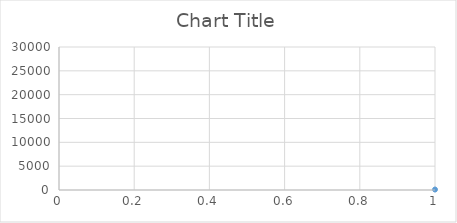
| Category | Series 0 |
|---|---|
| 0 | 100 |
| 1 | 103 |
| 2 | 106.09 |
| 3 | 109.273 |
| 4 | 112.551 |
| 5 | 115.927 |
| 6 | 119.405 |
| 7 | 122.987 |
| 8 | 126.677 |
| 9 | 130.477 |
| 10 | 134.392 |
| 11 | 138.423 |
| 12 | 142.576 |
| 13 | 146.853 |
| 14 | 151.259 |
| 15 | 155.797 |
| 16 | 160.471 |
| 17 | 165.285 |
| 18 | 170.243 |
| 19 | 175.351 |
| 20 | 180.611 |
| 21 | 186.029 |
| 22 | 191.61 |
| 23 | 197.359 |
| 24 | 203.279 |
| 25 | 209.378 |
| 26 | 215.659 |
| 27 | 222.129 |
| 28 | 228.793 |
| 29 | 235.657 |
| 30 | 242.726 |
| 31 | 250.008 |
| 32 | 257.508 |
| 33 | 265.234 |
| 34 | 273.191 |
| 35 | 281.386 |
| 36 | 289.828 |
| 37 | 298.523 |
| 38 | 307.478 |
| 39 | 316.703 |
| 40 | 326.204 |
| 41 | 335.99 |
| 42 | 346.07 |
| 43 | 356.452 |
| 44 | 367.145 |
| 45 | 378.16 |
| 46 | 389.504 |
| 47 | 401.19 |
| 48 | 413.225 |
| 49 | 425.622 |
| 50 | 438.391 |
| 51 | 451.542 |
| 52 | 465.089 |
| 53 | 479.041 |
| 54 | 493.412 |
| 55 | 508.215 |
| 56 | 523.461 |
| 57 | 539.165 |
| 58 | 555.34 |
| 59 | 572 |
| 60 | 589.16 |
| 61 | 606.835 |
| 62 | 625.04 |
| 63 | 643.791 |
| 64 | 663.105 |
| 65 | 682.998 |
| 66 | 703.488 |
| 67 | 724.593 |
| 68 | 746.331 |
| 69 | 768.721 |
| 70 | 791.782 |
| 71 | 815.536 |
| 72 | 840.002 |
| 73 | 865.202 |
| 74 | 891.158 |
| 75 | 917.893 |
| 76 | 945.429 |
| 77 | 973.792 |
| 78 | 1003.006 |
| 79 | 1033.096 |
| 80 | 1064.089 |
| 81 | 1096.012 |
| 82 | 1128.892 |
| 83 | 1162.759 |
| 84 | 1197.642 |
| 85 | 1233.571 |
| 86 | 1270.578 |
| 87 | 1308.695 |
| 88 | 1347.956 |
| 89 | 1388.395 |
| 90 | 1430.047 |
| 91 | 1472.948 |
| 92 | 1517.137 |
| 93 | 1562.651 |
| 94 | 1609.53 |
| 95 | 1657.816 |
| 96 | 1707.551 |
| 97 | 1758.777 |
| 98 | 1811.54 |
| 99 | 1865.887 |
| 100 | 1921.863 |
| 101 | 1979.519 |
| 102 | 2038.905 |
| 103 | 2100.072 |
| 104 | 2163.074 |
| 105 | 2227.966 |
| 106 | 2294.805 |
| 107 | 2363.649 |
| 108 | 2434.559 |
| 109 | 2507.596 |
| 110 | 2582.823 |
| 111 | 2660.308 |
| 112 | 2740.117 |
| 113 | 2822.321 |
| 114 | 2906.991 |
| 115 | 2994.2 |
| 116 | 3084.026 |
| 117 | 3176.547 |
| 118 | 3271.843 |
| 119 | 3369.999 |
| 120 | 3471.099 |
| 121 | 3575.232 |
| 122 | 3682.489 |
| 123 | 3792.963 |
| 124 | 3906.752 |
| 125 | 4023.955 |
| 126 | 4144.673 |
| 127 | 4269.014 |
| 128 | 4397.084 |
| 129 | 4528.997 |
| 130 | 4664.866 |
| 131 | 4804.812 |
| 132 | 4948.957 |
| 133 | 5097.425 |
| 134 | 5250.348 |
| 135 | 5407.859 |
| 136 | 5570.094 |
| 137 | 5737.197 |
| 138 | 5909.313 |
| 139 | 6086.593 |
| 140 | 6269.19 |
| 141 | 6457.266 |
| 142 | 6650.984 |
| 143 | 6850.514 |
| 144 | 7056.029 |
| 145 | 7267.71 |
| 146 | 7485.741 |
| 147 | 7710.313 |
| 148 | 7941.623 |
| 149 | 8179.871 |
| 150 | 8425.268 |
| 151 | 8678.026 |
| 152 | 8938.366 |
| 153 | 9206.517 |
| 154 | 9482.713 |
| 155 | 9767.194 |
| 156 | 10060.21 |
| 157 | 10362.016 |
| 158 | 10672.877 |
| 159 | 10993.063 |
| 160 | 11322.855 |
| 161 | 11662.541 |
| 162 | 12012.417 |
| 163 | 12372.79 |
| 164 | 12743.973 |
| 165 | 13126.292 |
| 166 | 13520.081 |
| 167 | 13925.684 |
| 168 | 14343.454 |
| 169 | 14773.758 |
| 170 | 15216.971 |
| 171 | 15673.48 |
| 172 | 16143.684 |
| 173 | 16627.995 |
| 174 | 17126.834 |
| 175 | 17640.639 |
| 176 | 18169.859 |
| 177 | 18714.954 |
| 178 | 19276.403 |
| 179 | 19854.695 |
| 180 | 20450.336 |
| 181 | 21063.846 |
| 182 | 21695.761 |
| 183 | 22346.634 |
| 184 | 23017.033 |
| 185 | 23707.544 |
| 186 | 24418.771 |
| 187 | 25151.334 |
| 188 | 25905.874 |
| 189 | 26683.05 |